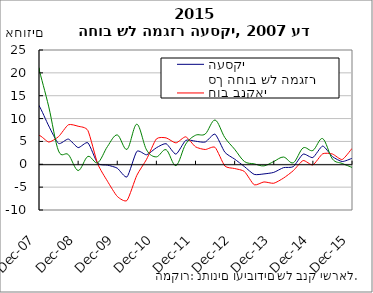
| Category | סך החוב של המגזר העסקי | חוב בנקאי | חוב חוץ בנקאי |
|---|---|---|---|
| 2007-03-31 | 10.326 | 2.396 | 21.536 |
| 2007-06-30 | 14.682 | 4.18 | 29.098 |
| 2007-09-30 | 14.849 | 4.428 | 28.786 |
| 2007-12-31 | 12.845 | 6.317 | 20.801 |
| 2008-03-31 | 8.369 | 4.86 | 12.548 |
| 2008-06-30 | 4.555 | 6.052 | 2.897 |
| 2008-09-30 | 5.511 | 8.642 | 2.116 |
| 2008-12-31 | 3.648 | 8.321 | -1.365 |
| 2009-03-31 | 4.695 | 7.372 | 1.724 |
| 2009-06-30 | 0.216 | 0.114 | 0.333 |
| 2009-09-30 | -0.179 | -3.707 | 3.89 |
| 2009-12-31 | -0.849 | -7.021 | 6.422 |
| 2010-03-31 | -2.757 | -7.901 | 3.268 |
| 2010-06-30 | 2.811 | -2.421 | 8.772 |
| 2010-09-30 | 2.081 | 1.098 | 3.133 |
| 2010-12-31 | 3.613 | 5.546 | 1.624 |
| 2011-03-31 | 4.504 | 5.771 | 3.18 |
| 2011-06-30 | 2.219 | 4.675 | -0.291 |
| 2011-09-30 | 5.225 | 6.003 | 4.411 |
| 2011-12-31 | 5.046 | 3.825 | 6.35 |
| 2012-03-31 | 4.873 | 3.231 | 6.631 |
| 2012-06-30 | 6.585 | 3.697 | 9.685 |
| 2012-09-30 | 2.636 | -0.374 | 5.839 |
| 2012-12-31 | 1.135 | -0.928 | 3.287 |
| 2013-03-31 | -0.505 | -1.576 | 0.606 |
| 2013-06-30 | -2.212 | -4.485 | 0.093 |
| 2013-09-30 | -2.106 | -3.86 | -0.349 |
| 2013-12-31 | -1.772 | -4.151 | 0.609 |
| 2014-03-31 | -0.733 | -3.018 | 1.584 |
| 2014-06-30 | -0.515 | -1.392 | 0.333 |
| 2014-09-30 | 2.223 | 0.816 | 3.583 |
| 2014-12-31 | 1.477 | -0.138 | 3.017 |
| 2015-03-31 | 3.985 | 2.297 | 5.62 |
| 2015-06-30 | 1.686 | 2.246 | 1.153 |
| 2015-09-30 | 0.6 | 1.048 | 0.178 |
| 2015-12-31 | 1.308 | 3.455 | -0.677 |